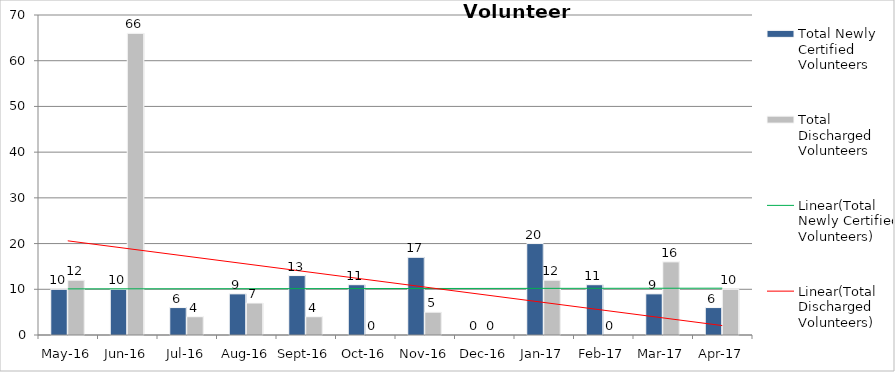
| Category | Total Newly Certified Volunteers | Total Discharged Volunteers |
|---|---|---|
| May-16 | 10 | 12 |
| Jun-16 | 10 | 66 |
| Jul-16 | 6 | 4 |
| Aug-16 | 9 | 7 |
| Sep-16 | 13 | 4 |
| Oct-16 | 11 | 0 |
| Nov-16 | 17 | 5 |
| Dec-16 | 0 | 0 |
| Jan-17 | 20 | 12 |
| Feb-17 | 11 | 0 |
| Mar-17 | 9 | 16 |
| Apr-17 | 6 | 10 |